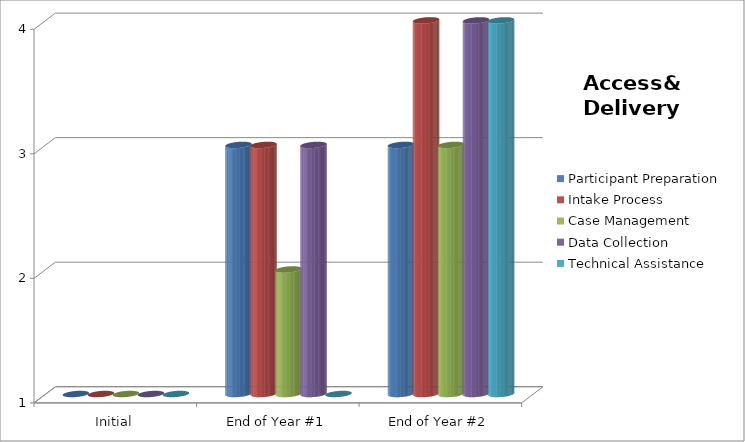
| Category | Participant Preparation  | Intake Process  | Case Management  | Data Collection  | Technical Assistance  |
|---|---|---|---|---|---|
| Initial | 1 | 1 | 1 | 1 | 1 |
| End of Year #1 | 3 | 3 | 2 | 3 | 1 |
| End of Year #2 | 3 | 4 | 3 | 4 | 4 |